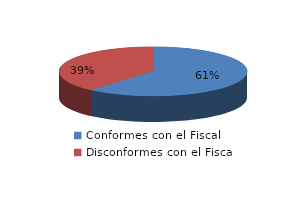
| Category | Series 0 |
|---|---|
| 0 | 30 |
| 1 | 19 |